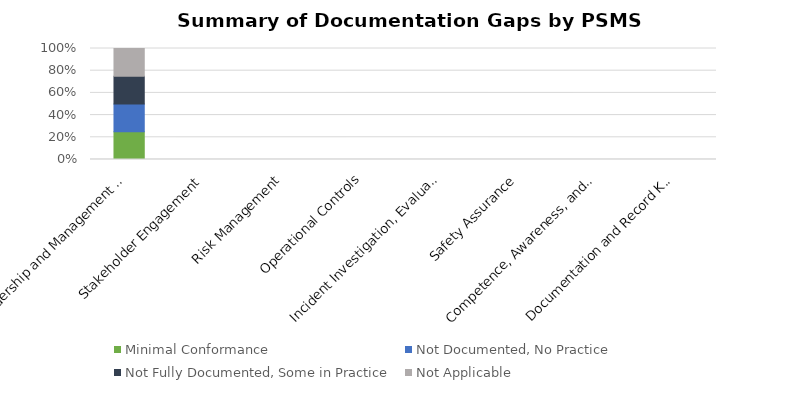
| Category | Minimal Conformance | Not Documented, No Practice | Not Fully Documented, Some in Practice | Not Applicable |
|---|---|---|---|---|
| Leadership and Management Commitment | 1 | 1 | 1 | 1 |
| Stakeholder Engagement | 0 | 0 | 0 | 0 |
| Risk Management | 0 | 0 | 0 | 0 |
| Operational Controls | 0 | 0 | 0 | 0 |
| Incident Investigation, Evaluation, and Lessons Learned | 0 | 0 | 0 | 0 |
| Safety Assurance | 0 | 0 | 0 | 0 |
| Competence, Awareness, and Training | 0 | 0 | 0 | 0 |
| Documentation and Record Keeping | 0 | 0 | 0 | 0 |